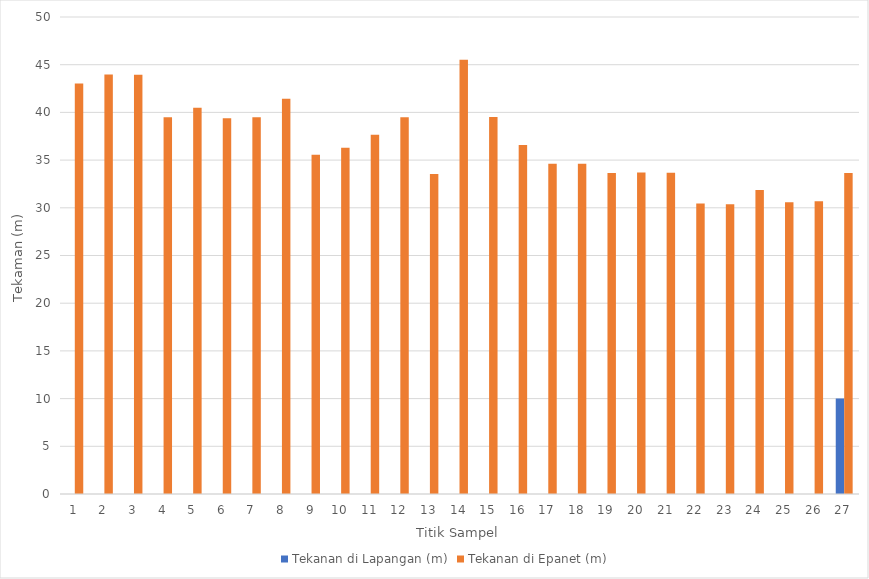
| Category | Tekanan di Lapangan (m) | Tekanan di Epanet (m) |
|---|---|---|
| 0 | 0 | 43.02 |
| 1 | 0 | 43.97 |
| 2 | 0 | 43.94 |
| 3 | 0 | 39.49 |
| 4 | 0 | 40.49 |
| 5 | 0 | 39.39 |
| 6 | 0 | 39.48 |
| 7 | 0 | 41.42 |
| 8 | 0 | 35.56 |
| 9 | 0 | 36.3 |
| 10 | 0 | 37.67 |
| 11 | 0 | 39.5 |
| 12 | 0 | 33.55 |
| 13 | 0 | 45.52 |
| 14 | 0 | 39.53 |
| 15 | 0 | 36.59 |
| 16 | 0 | 34.62 |
| 17 | 0 | 34.61 |
| 18 | 0 | 33.64 |
| 19 | 0 | 33.69 |
| 20 | 0 | 33.68 |
| 21 | 0 | 30.45 |
| 22 | 0 | 30.38 |
| 23 | 0 | 31.87 |
| 24 | 0 | 30.59 |
| 25 | 0 | 30.68 |
| 26 | 10 | 33.64 |